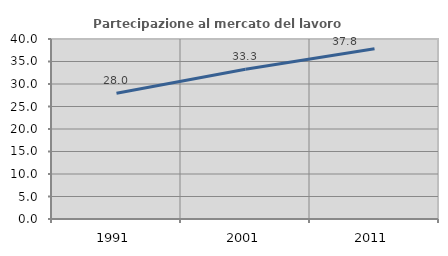
| Category | Partecipazione al mercato del lavoro  femminile |
|---|---|
| 1991.0 | 27.951 |
| 2001.0 | 33.271 |
| 2011.0 | 37.838 |